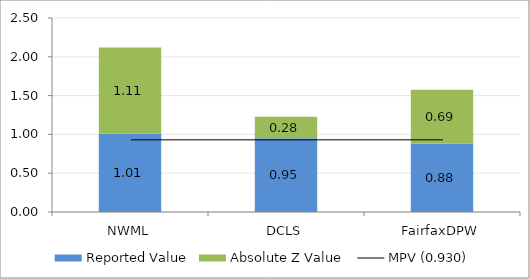
| Category | Reported Value | Absolute Z Value  |
|---|---|---|
| NWML | 1.01 | 1.111 |
| DCLS | 0.95 | 0.278 |
| FairfaxDPW | 0.88 | 0.694 |